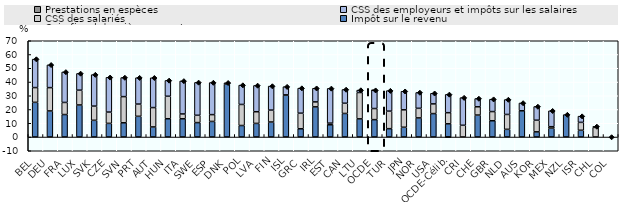
| Category | Impôt sur le revenu | CSS des salariés | CSS des employeurs et impôts sur les salaires | Prestations en espèces |
|---|---|---|---|---|
| BEL | 25.214 | 10.739 | 20.712 | 0 |
| DEU | 18.956 | 16.96 | 16.572 | 0 |
| FRA | 16.331 | 8.8 | 22.194 | 0 |
| LUX | 23.306 | 10.757 | 12.157 | 0 |
| SVK | 12.138 | 10.332 | 22.899 | 0 |
| CZE | 9.912 | 8.221 | 25.262 | 0 |
| SVN | 10.339 | 19.035 | 13.867 | 0 |
| PRT | 15.056 | 8.889 | 19.192 | 0 |
| AUT | 7.321 | 14.082 | 21.666 | 0 |
| HUN | 13.274 | 16.372 | 11.504 | 0 |
| ITA | 13.243 | 3.529 | 24.001 | 0 |
| SWE | 10.48 | 5.326 | 23.908 | 0 |
| ESP | 11.327 | 4.946 | 23.313 | 0 |
| DNK | 38.508 | 0 | 0.909 | 0 |
| POL | 8.36 | 15.32 | 14.06 | 0 |
| LVA | 9.893 | 8.493 | 19.11 | 0 |
| FIN | 10.901 | 8.658 | 17.492 | 0 |
| ISL | 30.466 | 0.174 | 5.971 | 0 |
| GRC | 5.981 | 11.342 | 18.227 | 0 |
| IRL | 21.924 | 3.602 | 9.95 | 0 |
| EST | 8.884 | 1.196 | 25.262 | 0 |
| CAN | 17.122 | 7.432 | 10 | 0 |
| LTU | 13.201 | 19.157 | 1.759 | 0 |
| OCDE | 12.631 | 8.084 | 13.299 | 0.018 |
| TUR | 6.062 | 12.766 | 14.894 | 0 |
| JPN | 7.102 | 12.672 | 13.502 | 0 |
| NOR | 13.882 | 6.991 | 11.504 | 0 |
| USA | 17.026 | 7.06 | 7.718 | 0 |
| OCDE-Célib. | 9.598 | 8.086 | 13.299 | -0.009 |
| CRI | 0 | 8.524 | 20.109 | 0 |
| CHE | 15.965 | 6.015 | 6.015 | 0 |
| GBR | 11.822 | 6.667 | 9.017 | 0 |
| NLD | 5.589 | 10.812 | 10.832 | 0 |
| AUS | 19.062 | 0 | 5.68 | 0 |
| KOR | 3.746 | 8.462 | 9.974 | 0 |
| MEX | 6.379 | 1.112 | 11.592 | 0 |
| NZL | 16.292 | 0 | 0 | 0 |
| ISR | 4.907 | 5.737 | 4.531 | 0 |
| CHL | 0 | 7 | 0 | 0.671 |
| COL | 0 | 0 | 0 | 0 |